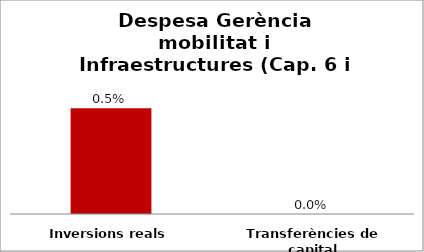
| Category | Series 0 |
|---|---|
| Inversions reals | 0.005 |
| Transferències de capital | 0 |